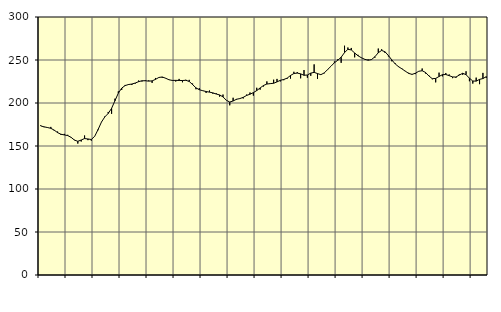
| Category | Piggar | Series 1 |
|---|---|---|
| nan | 174.1 | 173.34 |
| 87.0 | 171.9 | 172.28 |
| 87.0 | 171.8 | 171.48 |
| 87.0 | 172.2 | 170.55 |
| nan | 167.9 | 168.46 |
| 88.0 | 166.8 | 165.57 |
| 88.0 | 162.8 | 163.67 |
| 88.0 | 164.1 | 162.88 |
| nan | 163 | 162.13 |
| 89.0 | 159.8 | 160.11 |
| 89.0 | 157.2 | 156.85 |
| 89.0 | 152.8 | 155.47 |
| nan | 155.2 | 156.97 |
| 90.0 | 162.2 | 158.65 |
| 90.0 | 156.8 | 158.16 |
| 90.0 | 156.2 | 157.57 |
| nan | 161.4 | 161.25 |
| 91.0 | 168.4 | 169.17 |
| 91.0 | 178 | 177.82 |
| 91.0 | 184.4 | 183.87 |
| nan | 189.6 | 187.83 |
| 92.0 | 187.4 | 193.79 |
| 92.0 | 205 | 202.62 |
| 92.0 | 213.5 | 211.45 |
| nan | 215.2 | 217.35 |
| 93.0 | 221 | 220.23 |
| 93.0 | 222 | 221.47 |
| 93.0 | 220.9 | 222.05 |
| nan | 222.5 | 223.21 |
| 94.0 | 226.1 | 224.79 |
| 94.0 | 225 | 225.85 |
| 94.0 | 226.5 | 225.86 |
| nan | 226.3 | 225.44 |
| 95.0 | 223.4 | 225.72 |
| 95.0 | 229.1 | 227.46 |
| 95.0 | 229.5 | 229.7 |
| nan | 229.3 | 230.26 |
| 96.0 | 228.6 | 228.83 |
| 96.0 | 226.8 | 227 |
| 96.0 | 225.8 | 226.27 |
| nan | 225 | 226.34 |
| 97.0 | 228 | 226.21 |
| 97.0 | 224.1 | 226.14 |
| 97.0 | 227 | 226.4 |
| nan | 226.9 | 225.05 |
| 98.0 | 222.6 | 221.4 |
| 98.0 | 216 | 217.59 |
| 98.0 | 217.2 | 215.44 |
| nan | 214.5 | 214.3 |
| 99.0 | 211.7 | 213.34 |
| 99.0 | 214.5 | 212.63 |
| 99.0 | 210.8 | 211.78 |
| nan | 211.3 | 210.42 |
| 0.0 | 207.4 | 209.39 |
| 0.0 | 209.8 | 207.12 |
| 0.0 | 203.3 | 203.12 |
| nan | 197.3 | 201.14 |
| 1.0 | 206.1 | 202.31 |
| 1.0 | 203.8 | 204.35 |
| 1.0 | 205 | 205.15 |
| nan | 205.3 | 206.59 |
| 2.0 | 209.8 | 208.77 |
| 2.0 | 212.2 | 210.23 |
| 2.0 | 208.6 | 212.05 |
| nan | 217.7 | 214.48 |
| 3.0 | 215.5 | 217.5 |
| 3.0 | 219.2 | 220.37 |
| 3.0 | 225.1 | 222.04 |
| nan | 222.8 | 222.53 |
| 4.0 | 227.1 | 222.96 |
| 4.0 | 228 | 224.56 |
| 4.0 | 225.1 | 226.4 |
| nan | 226.5 | 227.35 |
| 5.0 | 228.2 | 228.9 |
| 5.0 | 228.4 | 232.01 |
| 5.0 | 236.3 | 234.28 |
| nan | 235.9 | 234.79 |
| 6.0 | 228.7 | 233.89 |
| 6.0 | 238.3 | 232.22 |
| 6.0 | 229.4 | 232.56 |
| nan | 231.6 | 234.74 |
| 7.0 | 244.9 | 235.63 |
| 7.0 | 228 | 234.21 |
| 7.0 | 233.1 | 232.95 |
| nan | 234.5 | 235 |
| 8.0 | 238.6 | 238.92 |
| 8.0 | 242.8 | 242.79 |
| 8.0 | 248.3 | 246.81 |
| nan | 250.8 | 249.69 |
| 9.0 | 246.7 | 253.22 |
| 9.0 | 266.6 | 258.64 |
| 9.0 | 264.5 | 262.42 |
| nan | 264 | 261.71 |
| 10.0 | 253.1 | 258.23 |
| 10.0 | 256 | 254.9 |
| 10.0 | 252.3 | 252.6 |
| nan | 251.1 | 250.81 |
| 11.0 | 250.7 | 249.75 |
| 11.0 | 250.2 | 250.51 |
| 11.0 | 252.7 | 253.79 |
| nan | 263.3 | 258.49 |
| 12.0 | 262.5 | 261.11 |
| 12.0 | 258.2 | 259.54 |
| 12.0 | 254.2 | 255.16 |
| nan | 248.5 | 250.12 |
| 13.0 | 246.2 | 245.49 |
| 13.0 | 242.7 | 242.21 |
| 13.0 | 240.1 | 239.7 |
| nan | 237.3 | 237 |
| 14.0 | 235.1 | 234.44 |
| 14.0 | 233.6 | 233.28 |
| 14.0 | 233.6 | 234.6 |
| nan | 237 | 236.91 |
| 15.0 | 240.1 | 237.51 |
| 15.0 | 234.3 | 235.52 |
| 15.0 | 231.9 | 231.41 |
| nan | 227.6 | 228.25 |
| 16.0 | 224 | 228.59 |
| 16.0 | 235.3 | 230.82 |
| 16.0 | 231 | 232.94 |
| nan | 234.9 | 233.11 |
| 17.0 | 233.2 | 231.78 |
| 17.0 | 228.9 | 230.32 |
| 17.0 | 229.3 | 230.16 |
| nan | 233.3 | 232.5 |
| 18.0 | 232.8 | 234.56 |
| 18.0 | 236.9 | 232.93 |
| 18.0 | 225.3 | 228.8 |
| nan | 222.6 | 225.58 |
| 19.0 | 229.5 | 225.43 |
| 19.0 | 221.9 | 227.46 |
| 19.0 | 235 | 228.45 |
| nan | 229.3 | 230.64 |